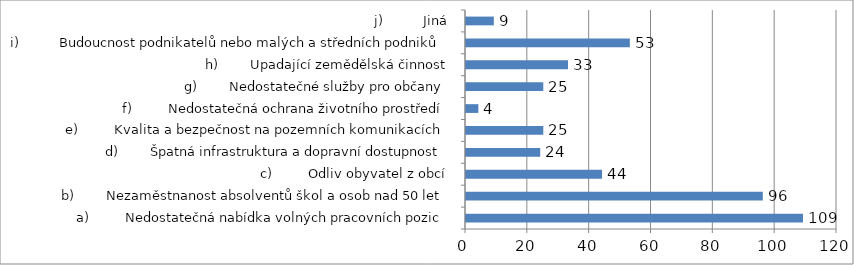
| Category | Series 0 |
|---|---|
| a)         Nedostatečná nabídka volných pracovních pozic | 109 |
| b)        Nezaměstnanost absolventů škol a osob nad 50 let | 96 |
| c)         Odliv obyvatel z obcí | 44 |
| d)        Špatná infrastruktura a dopravní dostupnost | 24 |
| e)         Kvalita a bezpečnost na pozemních komunikacích | 25 |
| f)         Nedostatečná ochrana životního prostředí | 4 |
| g)        Nedostatečné služby pro občany | 25 |
| h)        Upadající zemědělská činnost | 33 |
| i)          Budoucnost podnikatelů nebo malých a středních podniků | 53 |
| j)          Jiná | 9 |